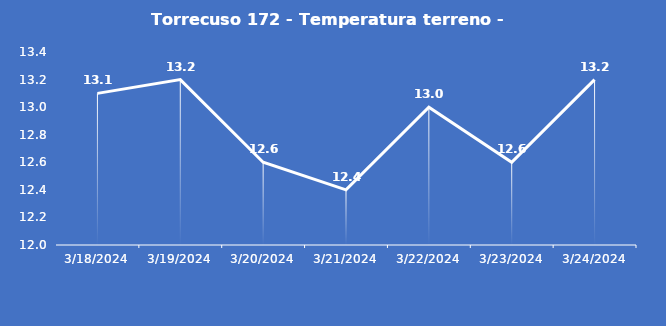
| Category | Torrecuso 172 - Temperatura terreno - Grezzo (°C) |
|---|---|
| 3/18/24 | 13.1 |
| 3/19/24 | 13.2 |
| 3/20/24 | 12.6 |
| 3/21/24 | 12.4 |
| 3/22/24 | 13 |
| 3/23/24 | 12.6 |
| 3/24/24 | 13.2 |